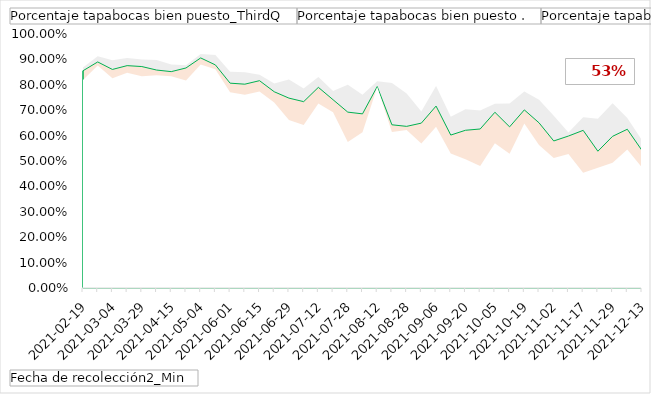
| Category | Porcentaje tapabocas bien puesto_ThirdQ | Porcentaje tapabocas bien puesto . | Porcentaje tapabocas bien puesto_FirstQule |
|---|---|---|---|
| 2021-02-19 | 0.868 | 0.855 | 0.819 |
| 2021-02-23 | 0.912 | 0.89 | 0.876 |
| 2021-03-04 | 0.896 | 0.86 | 0.825 |
| 2021-03-10 | 0.906 | 0.875 | 0.848 |
| 2021-03-29 | 0.9 | 0.872 | 0.833 |
| 2021-04-06 | 0.897 | 0.858 | 0.838 |
| 2021-04-15 | 0.88 | 0.852 | 0.833 |
| 2021-04-20 | 0.877 | 0.866 | 0.817 |
| 2021-05-04 | 0.921 | 0.906 | 0.88 |
| 2021-05-21 | 0.917 | 0.878 | 0.861 |
| 2021-06-01 | 0.852 | 0.806 | 0.771 |
| 2021-06-08 | 0.85 | 0.802 | 0.761 |
| 2021-06-15 | 0.839 | 0.816 | 0.773 |
| 2021-06-21 | 0.805 | 0.773 | 0.731 |
| 2021-06-29 | 0.82 | 0.748 | 0.662 |
| 2021-07-06 | 0.785 | 0.734 | 0.642 |
| 2021-07-12 | 0.83 | 0.79 | 0.726 |
| 2021-07-19 | 0.775 | 0.741 | 0.692 |
| 2021-07-28 | 0.8 | 0.692 | 0.575 |
| 2021-08-03 | 0.761 | 0.686 | 0.613 |
| 2021-08-12 | 0.814 | 0.793 | 0.792 |
| 2021-08-17 | 0.807 | 0.643 | 0.614 |
| 2021-08-28 | 0.766 | 0.636 | 0.622 |
| 2021-08-30 | 0.695 | 0.649 | 0.569 |
| 2021-09-06 | 0.796 | 0.716 | 0.635 |
| 2021-09-13 | 0.674 | 0.602 | 0.529 |
| 2021-09-20 | 0.704 | 0.621 | 0.506 |
| 2021-09-27 | 0.699 | 0.626 | 0.481 |
| 2021-10-05 | 0.725 | 0.692 | 0.57 |
| 2021-10-12 | 0.726 | 0.634 | 0.529 |
| 2021-10-19 | 0.773 | 0.701 | 0.648 |
| 2021-10-26 | 0.741 | 0.65 | 0.563 |
| 2021-11-02 | 0.678 | 0.579 | 0.512 |
| 2021-11-09 | 0.612 | 0.598 | 0.527 |
| 2021-11-17 | 0.672 | 0.621 | 0.453 |
| 2021-11-22 | 0.667 | 0.538 | 0.474 |
| 2021-11-29 | 0.728 | 0.597 | 0.493 |
| 2021-12-07 | 0.669 | 0.625 | 0.545 |
| 2021-12-13 | 0.581 | 0.541 | 0.474 |